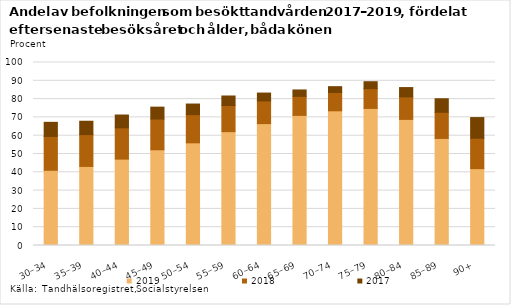
| Category | 2019 | 2018 | 2017 |
|---|---|---|---|
| 30–34 | 41.1 | 18.5 | 7.7 |
| 35–39 | 43.2 | 17.4 | 7.3 |
| 40–44 | 47.2 | 17.1 | 7 |
| 45–49 | 52.3 | 16.8 | 6.5 |
| 50–54 | 56.1 | 15.4 | 5.8 |
| 55–59 | 62.2 | 14.3 | 5.2 |
| 60–64 | 66.6 | 12.4 | 4.3 |
| 65–69 | 71.1 | 10.4 | 3.5 |
| 70–74 | 73.6 | 10 | 3.2 |
| 75–79 | 74.9 | 10.8 | 3.8 |
| 80–84 | 68.9 | 12.3 | 5.1 |
| 85–89 | 58.5 | 14.3 | 7.4 |
| 90+ | 42 | 16.6 | 11.3 |